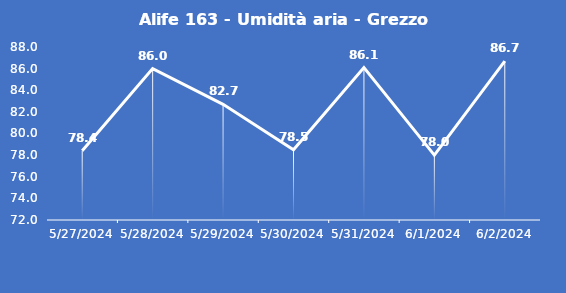
| Category | Alife 163 - Umidità aria - Grezzo (%) |
|---|---|
| 5/27/24 | 78.4 |
| 5/28/24 | 86 |
| 5/29/24 | 82.7 |
| 5/30/24 | 78.5 |
| 5/31/24 | 86.1 |
| 6/1/24 | 78 |
| 6/2/24 | 86.7 |